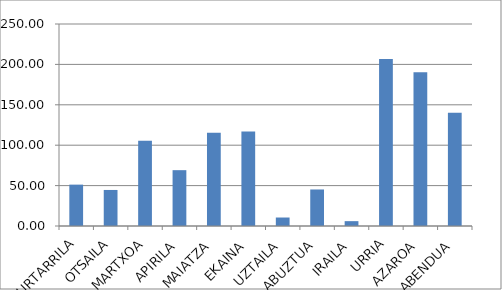
| Category | Series 0 |
|---|---|
| URTARRILA | 51.2 |
| OTSAILA | 44.6 |
| MARTXOA | 105.4 |
| APIRILA | 69.1 |
| MAIATZA | 115.5 |
| EKAINA | 117 |
| UZTAILA | 10.5 |
| ABUZTUA | 45.2 |
| IRAILA | 6 |
| URRIA | 206.6 |
| AZAROA | 190.4 |
| ABENDUA | 140.1 |